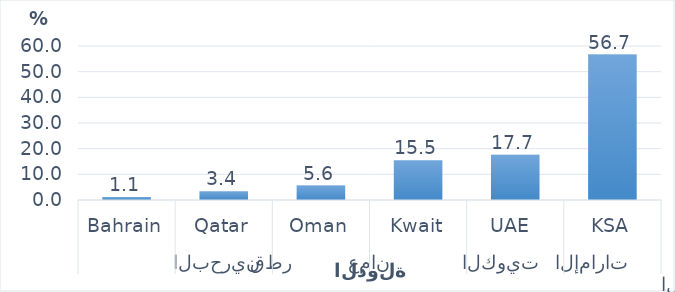
| Category | Series 0 |
|---|---|
| 0 | 56.68 |
| 1 | 17.672 |
| 2 | 15.475 |
| 3 | 5.611 |
| 4 | 3.441 |
| 5 | 1.122 |